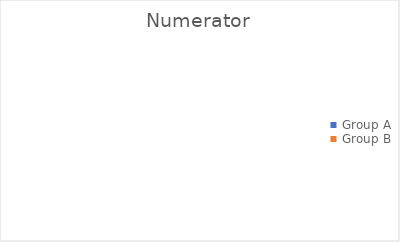
| Category | Numerator |
|---|---|
| Group A | 0 |
| Group B | 0 |